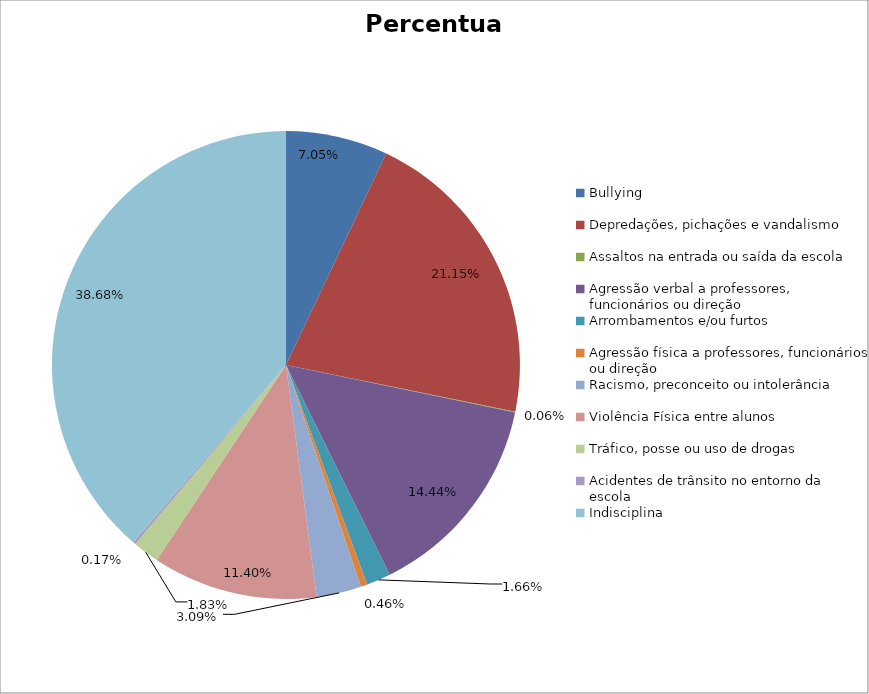
| Category | Percentual |
|---|---|
| Bullying | 0.07 |
| Depredações, pichações e vandalismo | 0.211 |
| Assaltos na entrada ou saída da escola | 0.001 |
| Agressão verbal a professores, funcionários ou direção | 0.144 |
| Arrombamentos e/ou furtos | 0.017 |
| Agressão física a professores, funcionários ou direção | 0.005 |
| Racismo, preconceito ou intolerância | 0.031 |
| Violência Física entre alunos | 0.114 |
| Tráfico, posse ou uso de drogas | 0.018 |
| Acidentes de trânsito no entorno da escola | 0.002 |
| Indisciplina | 0.387 |